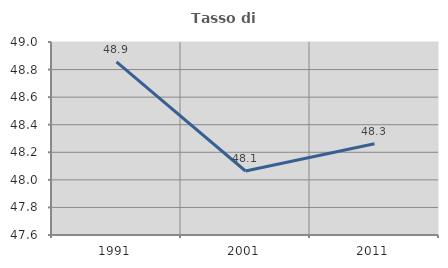
| Category | Tasso di occupazione   |
|---|---|
| 1991.0 | 48.855 |
| 2001.0 | 48.064 |
| 2011.0 | 48.262 |